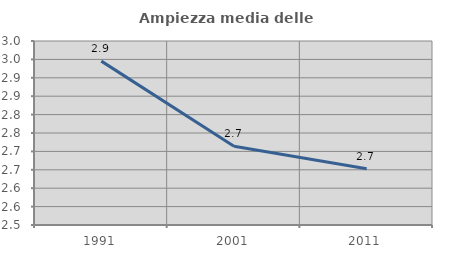
| Category | Ampiezza media delle famiglie |
|---|---|
| 1991.0 | 2.945 |
| 2001.0 | 2.714 |
| 2011.0 | 2.653 |